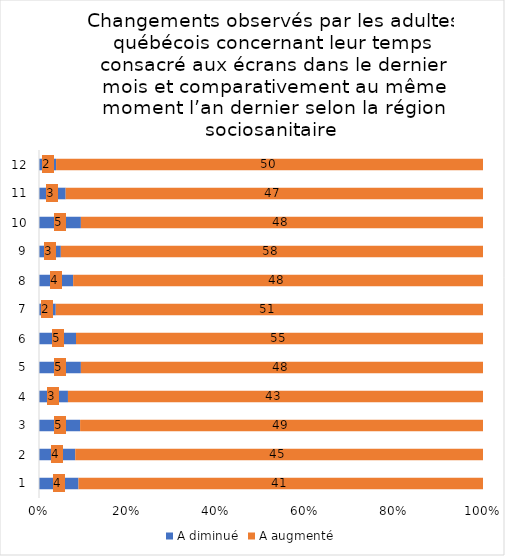
| Category | A diminué | A augmenté |
|---|---|---|
| 0 | 4 | 41 |
| 1 | 4 | 45 |
| 2 | 5 | 49 |
| 3 | 3 | 43 |
| 4 | 5 | 48 |
| 5 | 5 | 55 |
| 6 | 2 | 51 |
| 7 | 4 | 48 |
| 8 | 3 | 58 |
| 9 | 5 | 48 |
| 10 | 3 | 47 |
| 11 | 2 | 50 |